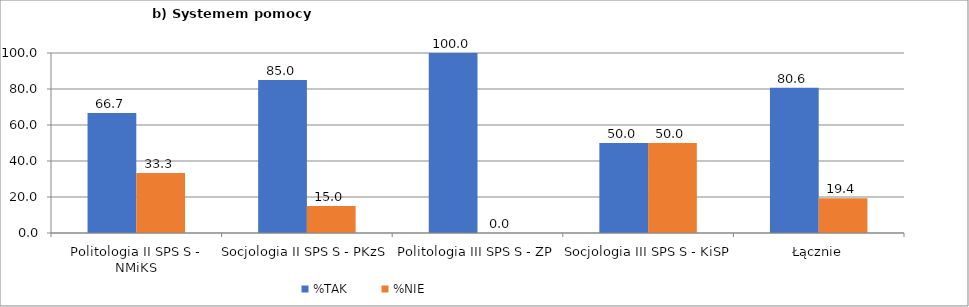
| Category | %TAK | %NIE |
|---|---|---|
| Politologia II SPS S - NMiKS | 66.667 | 33.333 |
| Socjologia II SPS S - PKzS | 85 | 15 |
| Politologia III SPS S - ZP | 100 | 0 |
| Socjologia III SPS S - KiSP | 50 | 50 |
| Łącznie | 80.645 | 19.355 |